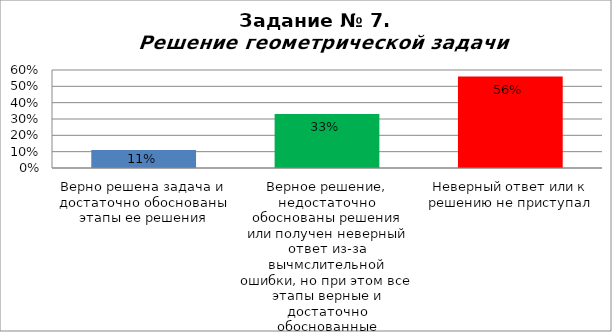
| Category | Решение геометрической задачи  |
|---|---|
| Верно решена задача и достаточно обоснованы этапы ее решения | 0.11 |
| Верное решение, недостаточно обоснованы решения или получен неверный ответ из-за вычмслительной ошибки, но при этом все этапы верные и достаточно обоснованные | 0.33 |
| Неверный ответ или к решению не приступал | 0.56 |